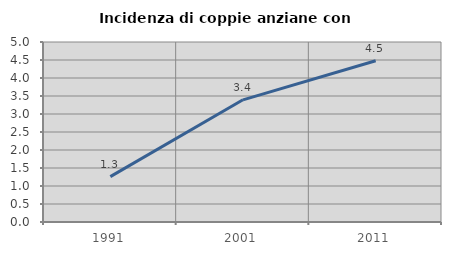
| Category | Incidenza di coppie anziane con figli |
|---|---|
| 1991.0 | 1.259 |
| 2001.0 | 3.394 |
| 2011.0 | 4.48 |